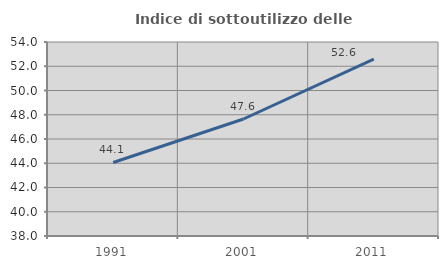
| Category | Indice di sottoutilizzo delle abitazioni  |
|---|---|
| 1991.0 | 44.062 |
| 2001.0 | 47.649 |
| 2011.0 | 52.581 |